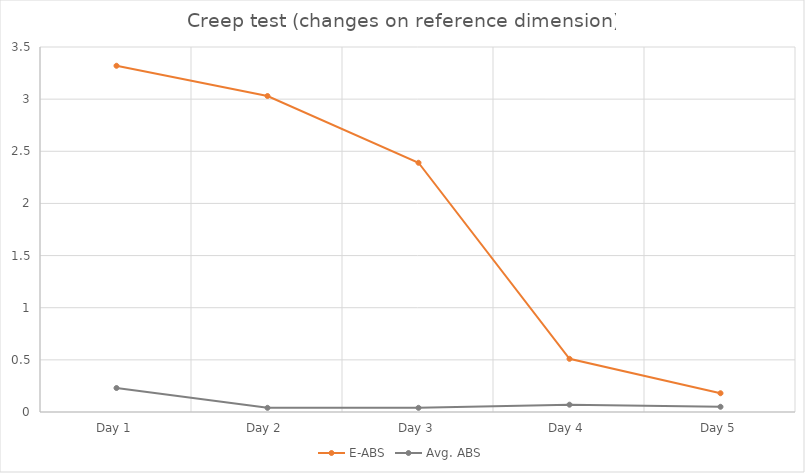
| Category | E-ABS | Avg. ABS |
|---|---|---|
| Day 1 | 3.32 | 0.23 |
| Day 2 | 3.03 | 0.04 |
| Day 3 | 2.39 | 0.04 |
| Day 4 | 0.51 | 0.07 |
| Day 5 | 0.18 | 0.05 |